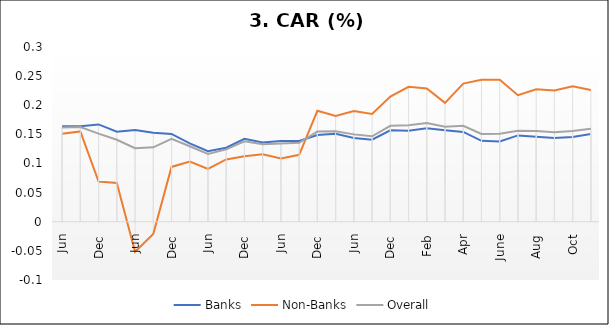
| Category | Banks | Non-Banks | Overall |
|---|---|---|---|
| 0 | 0.164 | 0.151 | 0.162 |
| 1 | 0.164 | 0.155 | 0.163 |
| 2 | 0.167 | 0.069 | 0.151 |
| 3 | 0.155 | 0.067 | 0.141 |
| 4 | 0.158 | -0.051 | 0.126 |
| 5 | 0.153 | -0.021 | 0.128 |
| 6 | 0.151 | 0.094 | 0.142 |
| 7 | 0.135 | 0.103 | 0.13 |
| 8 | 0.121 | 0.091 | 0.116 |
| 9 | 0.127 | 0.107 | 0.124 |
| 10 | 0.142 | 0.113 | 0.138 |
| 11 | 0.136 | 0.116 | 0.133 |
| 12 | 0.139 | 0.109 | 0.134 |
| 13 | 0.139 | 0.115 | 0.136 |
| 14 | 0.149 | 0.191 | 0.155 |
| 15 | 0.151 | 0.182 | 0.156 |
| 16 | 0.144 | 0.19 | 0.15 |
| 17 | 0.141 | 0.185 | 0.147 |
| 18 | 0.157 | 0.215 | 0.165 |
| 19 | 0.156 | 0.232 | 0.166 |
| 20 | 0.161 | 0.229 | 0.169 |
| 21 | 0.157 | 0.204 | 0.163 |
| 22 | 0.154 | 0.237 | 0.165 |
| 23 | 0.139 | 0.244 | 0.151 |
| 24 | 0.138 | 0.244 | 0.151 |
| 25 | 0.148 | 0.217 | 0.156 |
| 26 | 0.146 | 0.228 | 0.156 |
| 27 | 0.144 | 0.226 | 0.153 |
| 28 | 0.146 | 0.233 | 0.156 |
| 29 | 0.151 | 0.226 | 0.16 |